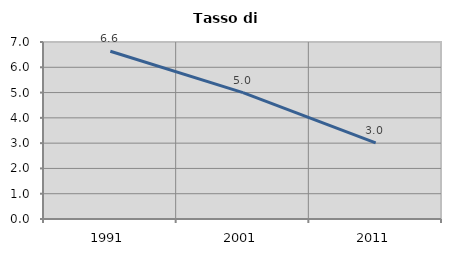
| Category | Tasso di disoccupazione   |
|---|---|
| 1991.0 | 6.633 |
| 2001.0 | 4.996 |
| 2011.0 | 3.01 |